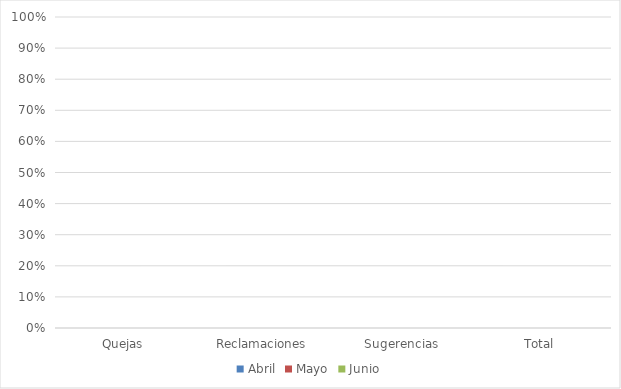
| Category | Abril | Mayo | Junio |
|---|---|---|---|
| Quejas | 0 | 0 | 0 |
| Reclamaciones | 0 | 0 | 0 |
| Sugerencias | 0 | 0 | 0 |
| Total | 0 | 0 | 0 |